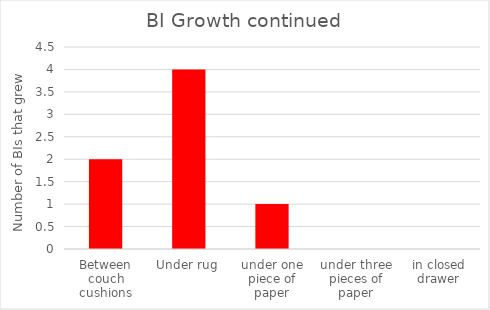
| Category | Series 0 |
|---|---|
| Between couch cushions | 2 |
| Under rug | 4 |
| under one piece of paper | 1 |
| under three pieces of paper | 0 |
| in closed drawer | 0 |